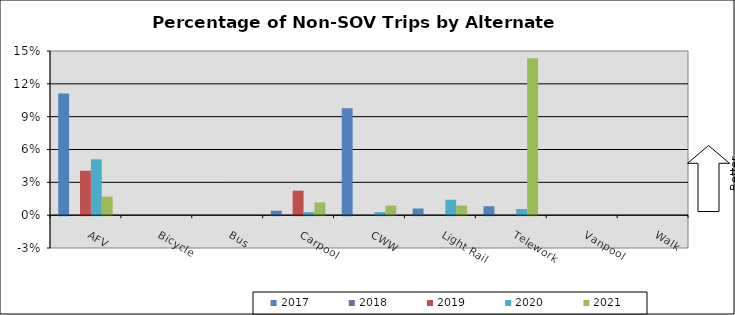
| Category | 2017 | 2018 | 2019 | 2020 | 2021 |
|---|---|---|---|---|---|
| AFV | 0.111 | 0 | 0.041 | 0.051 | 0.017 |
| Bicycle | 0 | 0 | 0 | 0 | 0 |
| Bus | 0 | 0 | 0 | 0 | 0 |
| Carpool | 0.004 | 0 | 0.022 | 0.003 | 0.012 |
| CWW | 0.098 | 0 | 0 | 0.003 | 0.009 |
| Light Rail | 0.006 | 0 | 0 | 0.014 | 0.009 |
| Telework | 0.008 | 0 | 0 | 0.006 | 0.143 |
| Vanpool | 0 | 0 | 0 | 0 | 0 |
| Walk | 0 | 0 | 0 | 0 | 0 |